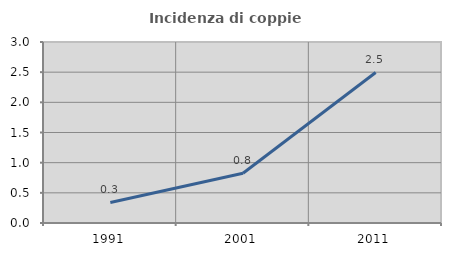
| Category | Incidenza di coppie miste |
|---|---|
| 1991.0 | 0.34 |
| 2001.0 | 0.825 |
| 2011.0 | 2.495 |